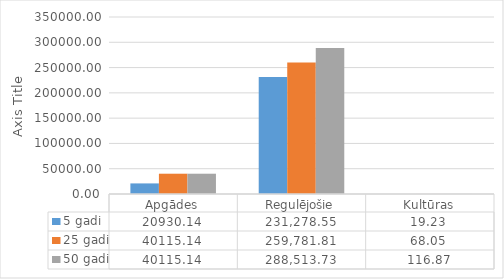
| Category | 5 gadi | 25 gadi | 50 gadi |
|---|---|---|---|
| Apgādes | 20930.139 | 40115.139 | 40115.14 |
| Regulējošie | 231278.554 | 259781.814 | 288513.734 |
| Kultūras | 19.23 | 68.05 | 116.87 |